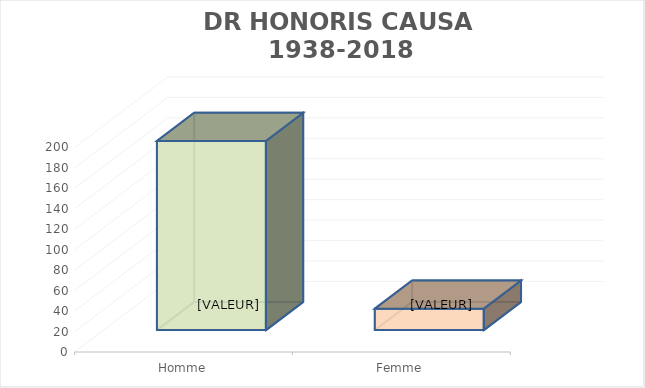
| Category | Series 0 |
|---|---|
| Homme | 185 |
| Femme | 21 |